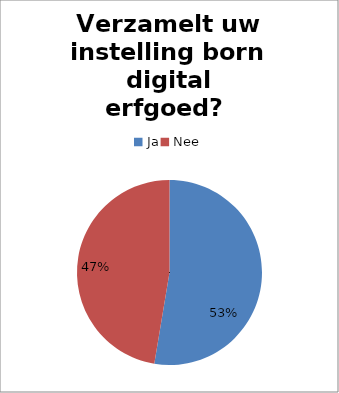
| Category | Series 0 |
|---|---|
| Ja | 70 |
| Nee | 63 |